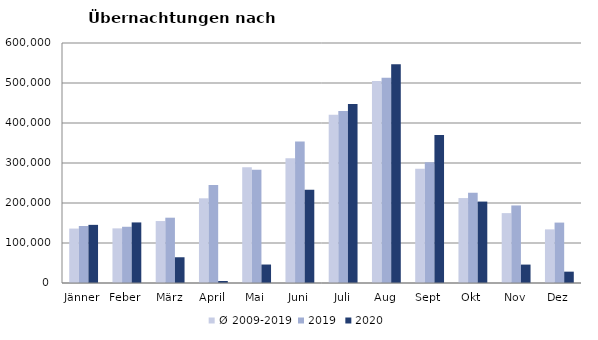
| Category | Ø 2009-2019 | 2019 | 2020 |
|---|---|---|---|
| Jänner | 136068.727 | 142561 | 145353 |
| Feber | 136576.364 | 140588 | 151431 |
| März | 154899.636 | 163253 | 64358 |
| April | 211739.545 | 244826 | 5072 |
| Mai | 289160.455 | 283418 | 46179 |
| Juni | 311846.455 | 353757 | 233437 |
| Juli | 420827.364 | 430134 | 447640 |
| Aug | 504983.182 | 513292 | 546671 |
| Sept | 285692.182 | 301838 | 369853 |
| Okt | 212345.273 | 225667 | 203553 |
| Nov | 174715.364 | 193867 | 46036 |
| Dez | 134061.727 | 151031 | 28353 |